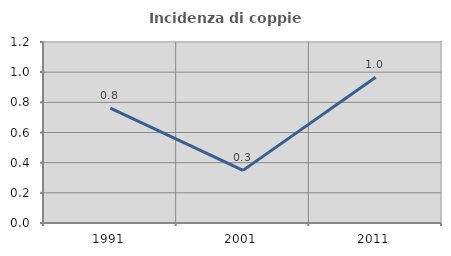
| Category | Incidenza di coppie miste |
|---|---|
| 1991.0 | 0.762 |
| 2001.0 | 0.349 |
| 2011.0 | 0.967 |